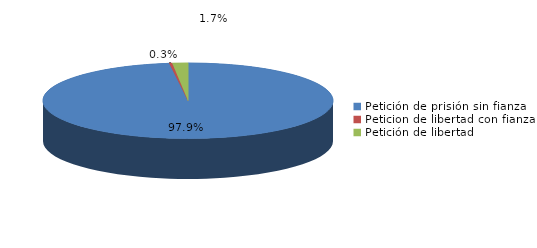
| Category | Series 0 |
|---|---|
| Petición de prisión sin fianza | 282 |
| Peticion de libertad con fianza | 1 |
| Petición de libertad | 5 |